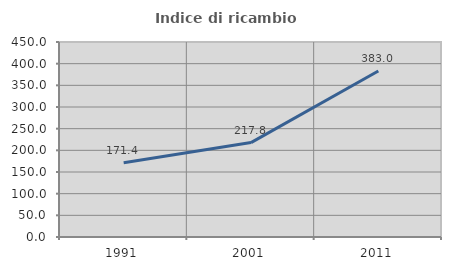
| Category | Indice di ricambio occupazionale  |
|---|---|
| 1991.0 | 171.407 |
| 2001.0 | 217.845 |
| 2011.0 | 382.957 |